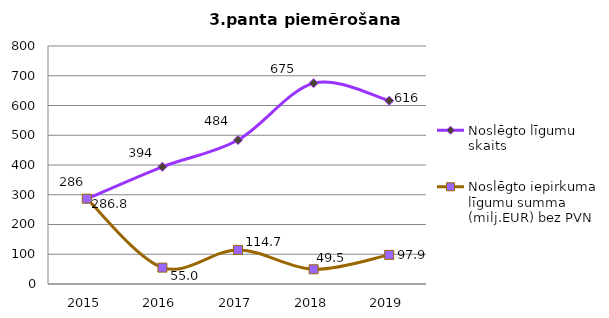
| Category | Noslēgto līgumu skaits | Noslēgto iepirkuma līgumu summa (milj.EUR) bez PVN |
|---|---|---|
| 2015.0 | 286 | 286.751 |
| 2016.0 | 394 | 54.993 |
| 2017.0 | 484 | 114.654 |
| 2018.0 | 675 | 49.536 |
| 2019.0 | 616 | 97.928 |